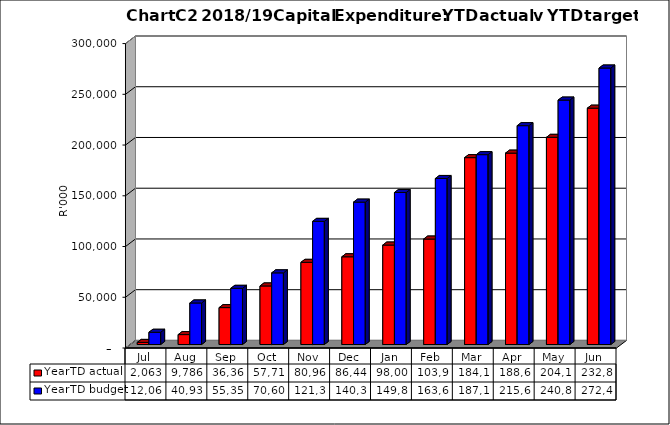
| Category | YearTD actual | YearTD budget |
|---|---|---|
| Jul | 2062645.29 | 12069496 |
| Aug | 9786337.4 | 40932210 |
| Sep | 36366130.64 | 55357694 |
| Oct | 57713972.09 | 70608784 |
| Nov | 80968917.35 | 121341343 |
| Dec | 86447656.09 | 140312988 |
| Jan | 98007127 | 149812988 |
| Feb | 103928979.71 | 163612988 |
| Mar | 184149918.34 | 187106017 |
| Apr | 188604305.95 | 215661105 |
| May | 204152489.32 | 240868819 |
| Jun | 232896014.37 | 272453658.22 |